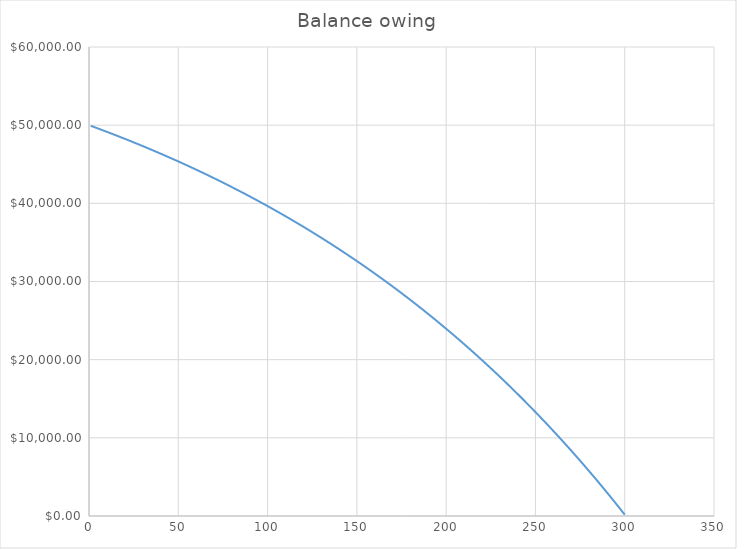
| Category | Series 0 |
|---|---|
| 1.0 | 49916.333 |
| 2.0 | 49832.318 |
| 3.0 | 49747.953 |
| 4.0 | 49663.236 |
| 5.0 | 49578.166 |
| 6.0 | 49492.742 |
| 7.0 | 49406.961 |
| 8.0 | 49320.824 |
| 9.0 | 49234.327 |
| 10.0 | 49147.47 |
| 11.0 | 49060.251 |
| 12.0 | 48972.669 |
| 13.0 | 48884.722 |
| 14.0 | 48796.408 |
| 15.0 | 48707.727 |
| 16.0 | 48618.675 |
| 17.0 | 48529.253 |
| 18.0 | 48439.458 |
| 19.0 | 48349.29 |
| 20.0 | 48258.745 |
| 21.0 | 48167.823 |
| 22.0 | 48076.522 |
| 23.0 | 47984.841 |
| 24.0 | 47892.778 |
| 25.0 | 47800.331 |
| 26.0 | 47707.499 |
| 27.0 | 47614.281 |
| 28.0 | 47520.673 |
| 29.0 | 47426.676 |
| 30.0 | 47332.287 |
| 31.0 | 47237.505 |
| 32.0 | 47142.328 |
| 33.0 | 47046.754 |
| 34.0 | 46950.783 |
| 35.0 | 46854.411 |
| 36.0 | 46757.638 |
| 37.0 | 46660.461 |
| 38.0 | 46562.88 |
| 39.0 | 46464.892 |
| 40.0 | 46366.495 |
| 41.0 | 46267.689 |
| 42.0 | 46168.471 |
| 43.0 | 46068.84 |
| 44.0 | 45968.793 |
| 45.0 | 45868.33 |
| 46.0 | 45767.448 |
| 47.0 | 45666.146 |
| 48.0 | 45564.421 |
| 49.0 | 45462.273 |
| 50.0 | 45359.699 |
| 51.0 | 45256.698 |
| 52.0 | 45153.267 |
| 53.0 | 45049.406 |
| 54.0 | 44945.112 |
| 55.0 | 44840.383 |
| 56.0 | 44735.218 |
| 57.0 | 44629.615 |
| 58.0 | 44523.572 |
| 59.0 | 44417.087 |
| 60.0 | 44310.158 |
| 61.0 | 44202.783 |
| 62.0 | 44094.962 |
| 63.0 | 43986.691 |
| 64.0 | 43877.969 |
| 65.0 | 43768.793 |
| 66.0 | 43659.163 |
| 67.0 | 43549.077 |
| 68.0 | 43438.531 |
| 69.0 | 43327.525 |
| 70.0 | 43216.056 |
| 71.0 | 43104.123 |
| 72.0 | 42991.724 |
| 73.0 | 42878.856 |
| 74.0 | 42765.518 |
| 75.0 | 42651.707 |
| 76.0 | 42537.423 |
| 77.0 | 42422.662 |
| 78.0 | 42307.423 |
| 79.0 | 42191.704 |
| 80.0 | 42075.503 |
| 81.0 | 41958.818 |
| 82.0 | 41841.646 |
| 83.0 | 41723.986 |
| 84.0 | 41605.836 |
| 85.0 | 41487.194 |
| 86.0 | 41368.057 |
| 87.0 | 41248.424 |
| 88.0 | 41128.292 |
| 89.0 | 41007.66 |
| 90.0 | 40886.526 |
| 91.0 | 40764.886 |
| 92.0 | 40642.74 |
| 93.0 | 40520.084 |
| 94.0 | 40396.918 |
| 95.0 | 40273.239 |
| 96.0 | 40149.044 |
| 97.0 | 40024.331 |
| 98.0 | 39899.1 |
| 99.0 | 39773.346 |
| 100.0 | 39647.068 |
| 101.0 | 39520.264 |
| 102.0 | 39392.932 |
| 103.0 | 39265.069 |
| 104.0 | 39136.674 |
| 105.0 | 39007.743 |
| 106.0 | 38878.275 |
| 107.0 | 38748.268 |
| 108.0 | 38617.719 |
| 109.0 | 38486.626 |
| 110.0 | 38354.987 |
| 111.0 | 38222.8 |
| 112.0 | 38090.062 |
| 113.0 | 37956.77 |
| 114.0 | 37822.923 |
| 115.0 | 37688.519 |
| 116.0 | 37553.554 |
| 117.0 | 37418.027 |
| 118.0 | 37281.936 |
| 119.0 | 37145.277 |
| 120.0 | 37008.049 |
| 121.0 | 36870.249 |
| 122.0 | 36731.876 |
| 123.0 | 36592.925 |
| 124.0 | 36453.396 |
| 125.0 | 36313.285 |
| 126.0 | 36172.59 |
| 127.0 | 36031.309 |
| 128.0 | 35889.44 |
| 129.0 | 35746.979 |
| 130.0 | 35603.925 |
| 131.0 | 35460.274 |
| 132.0 | 35316.026 |
| 133.0 | 35171.176 |
| 134.0 | 35025.722 |
| 135.0 | 34879.663 |
| 136.0 | 34732.995 |
| 137.0 | 34585.715 |
| 138.0 | 34437.823 |
| 139.0 | 34289.314 |
| 140.0 | 34140.186 |
| 141.0 | 33990.436 |
| 142.0 | 33840.063 |
| 143.0 | 33689.064 |
| 144.0 | 33537.435 |
| 145.0 | 33385.174 |
| 146.0 | 33232.279 |
| 147.0 | 33078.747 |
| 148.0 | 32924.575 |
| 149.0 | 32769.76 |
| 150.0 | 32614.301 |
| 151.0 | 32458.194 |
| 152.0 | 32301.437 |
| 153.0 | 32144.026 |
| 154.0 | 31985.959 |
| 155.0 | 31827.234 |
| 156.0 | 31667.848 |
| 157.0 | 31507.797 |
| 158.0 | 31347.079 |
| 159.0 | 31185.692 |
| 160.0 | 31023.633 |
| 161.0 | 30860.898 |
| 162.0 | 30697.485 |
| 163.0 | 30533.391 |
| 164.0 | 30368.614 |
| 165.0 | 30203.149 |
| 166.0 | 30036.996 |
| 167.0 | 29870.15 |
| 168.0 | 29702.609 |
| 169.0 | 29534.37 |
| 170.0 | 29365.43 |
| 171.0 | 29195.786 |
| 172.0 | 29025.435 |
| 173.0 | 28854.374 |
| 174.0 | 28682.601 |
| 175.0 | 28510.112 |
| 176.0 | 28336.904 |
| 177.0 | 28162.974 |
| 178.0 | 27988.32 |
| 179.0 | 27812.938 |
| 180.0 | 27636.825 |
| 181.0 | 27459.978 |
| 182.0 | 27282.395 |
| 183.0 | 27104.072 |
| 184.0 | 26925.005 |
| 185.0 | 26745.193 |
| 186.0 | 26564.631 |
| 187.0 | 26383.317 |
| 188.0 | 26201.248 |
| 189.0 | 26018.419 |
| 190.0 | 25834.83 |
| 191.0 | 25650.475 |
| 192.0 | 25465.352 |
| 193.0 | 25279.457 |
| 194.0 | 25092.788 |
| 195.0 | 24905.342 |
| 196.0 | 24717.114 |
| 197.0 | 24528.102 |
| 198.0 | 24338.302 |
| 199.0 | 24147.712 |
| 200.0 | 23956.327 |
| 201.0 | 23764.145 |
| 202.0 | 23571.163 |
| 203.0 | 23377.376 |
| 204.0 | 23182.782 |
| 205.0 | 22987.376 |
| 206.0 | 22791.157 |
| 207.0 | 22594.12 |
| 208.0 | 22396.263 |
| 209.0 | 22197.58 |
| 210.0 | 21998.07 |
| 211.0 | 21797.729 |
| 212.0 | 21596.553 |
| 213.0 | 21394.538 |
| 214.0 | 21191.682 |
| 215.0 | 20987.981 |
| 216.0 | 20783.431 |
| 217.0 | 20578.028 |
| 218.0 | 20371.77 |
| 219.0 | 20164.653 |
| 220.0 | 19956.672 |
| 221.0 | 19747.825 |
| 222.0 | 19538.107 |
| 223.0 | 19327.516 |
| 224.0 | 19116.048 |
| 225.0 | 18903.698 |
| 226.0 | 18690.463 |
| 227.0 | 18476.34 |
| 228.0 | 18261.325 |
| 229.0 | 18045.414 |
| 230.0 | 17828.603 |
| 231.0 | 17610.889 |
| 232.0 | 17392.267 |
| 233.0 | 17172.735 |
| 234.0 | 16952.288 |
| 235.0 | 16730.923 |
| 236.0 | 16508.635 |
| 237.0 | 16285.421 |
| 238.0 | 16061.277 |
| 239.0 | 15836.199 |
| 240.0 | 15610.183 |
| 241.0 | 15383.225 |
| 242.0 | 15155.322 |
| 243.0 | 14926.469 |
| 244.0 | 14696.663 |
| 245.0 | 14465.899 |
| 246.0 | 14234.174 |
| 247.0 | 14001.483 |
| 248.0 | 13767.822 |
| 249.0 | 13533.188 |
| 250.0 | 13297.577 |
| 251.0 | 13060.983 |
| 252.0 | 12823.404 |
| 253.0 | 12584.835 |
| 254.0 | 12345.272 |
| 255.0 | 12104.71 |
| 256.0 | 11863.146 |
| 257.0 | 11620.576 |
| 258.0 | 11376.995 |
| 259.0 | 11132.399 |
| 260.0 | 10886.784 |
| 261.0 | 10640.146 |
| 262.0 | 10392.48 |
| 263.0 | 10143.782 |
| 264.0 | 9894.048 |
| 265.0 | 9643.273 |
| 266.0 | 9391.453 |
| 267.0 | 9138.584 |
| 268.0 | 8884.662 |
| 269.0 | 8629.681 |
| 270.0 | 8373.638 |
| 271.0 | 8116.528 |
| 272.0 | 7858.347 |
| 273.0 | 7599.09 |
| 274.0 | 7338.753 |
| 275.0 | 7077.331 |
| 276.0 | 6814.82 |
| 277.0 | 6551.215 |
| 278.0 | 6286.512 |
| 279.0 | 6020.706 |
| 280.0 | 5753.792 |
| 281.0 | 5485.766 |
| 282.0 | 5216.624 |
| 283.0 | 4946.36 |
| 284.0 | 4674.969 |
| 285.0 | 4402.448 |
| 286.0 | 4128.792 |
| 287.0 | 3853.995 |
| 288.0 | 3578.054 |
| 289.0 | 3300.962 |
| 290.0 | 3022.716 |
| 291.0 | 2743.311 |
| 292.0 | 2462.741 |
| 293.0 | 2181.003 |
| 294.0 | 1898.09 |
| 295.0 | 1613.999 |
| 296.0 | 1328.724 |
| 297.0 | 1042.26 |
| 298.0 | 754.603 |
| 299.0 | 465.747 |
| 300.0 | 175.688 |